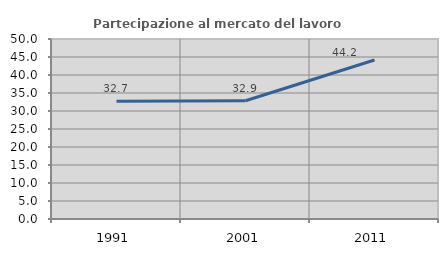
| Category | Partecipazione al mercato del lavoro  femminile |
|---|---|
| 1991.0 | 32.733 |
| 2001.0 | 32.859 |
| 2011.0 | 44.177 |